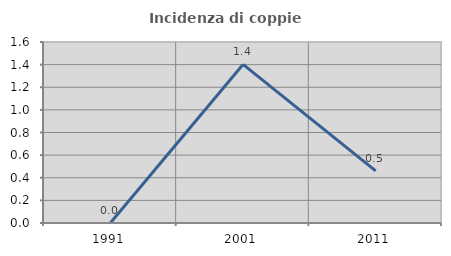
| Category | Incidenza di coppie miste |
|---|---|
| 1991.0 | 0 |
| 2001.0 | 1.402 |
| 2011.0 | 0.461 |